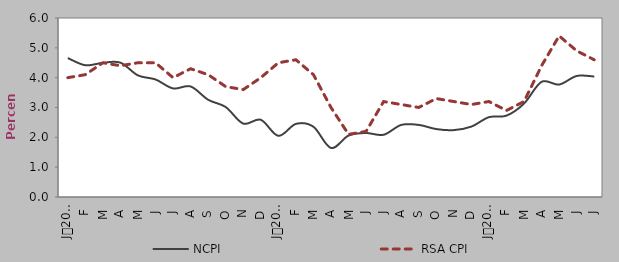
| Category | NCPI | RSA CPI |
|---|---|---|
| 0 | 4.658 | 4 |
| 1900-01-01 | 4.416 | 4.1 |
| 1900-01-02 | 4.498 | 4.5 |
| 1900-01-03 | 4.503 | 4.4 |
| 1900-01-04 | 4.076 | 4.5 |
| 1900-01-05 | 3.939 | 4.5 |
| 1900-01-06 | 3.639 | 4 |
| 1900-01-07 | 3.705 | 4.3 |
| 1900-01-08 | 3.259 | 4.1 |
| 1900-01-09 | 3.015 | 3.7 |
| 1900-01-10 | 2.461 | 3.6 |
| 1900-01-11 | 2.588 | 4 |
| 1900-01-12 | 2.05 | 4.5 |
| 1900-01-13 | 2.45 | 4.6 |
| 1900-01-14 | 2.354 | 4.1 |
| 1900-01-15 | 1.643 | 3 |
| 1900-01-16 | 2.06 | 2.1 |
| 1900-01-17 | 2.145 | 2.2 |
| 1900-01-18 | 2.087 | 3.2 |
| 1900-01-19 | 2.416 | 3.1 |
| 1900-01-20 | 2.416 | 3 |
| 1900-01-21 | 2.277 | 3.3 |
| 1900-01-22 | 2.242 | 3.2 |
| 1900-01-23 | 2.361 | 3.1 |
| 1900-01-24 | 2.676 | 3.2 |
| 1900-01-25 | 2.728 | 2.9 |
| 1900-01-26 | 3.133 | 3.2 |
| 1900-01-27 | 3.861 | 4.4 |
| 1900-01-28 | 3.769 | 5.4 |
| 1900-01-29 | 4.057 | 4.9 |
| 1900-01-30 | 4.038 | 4.6 |